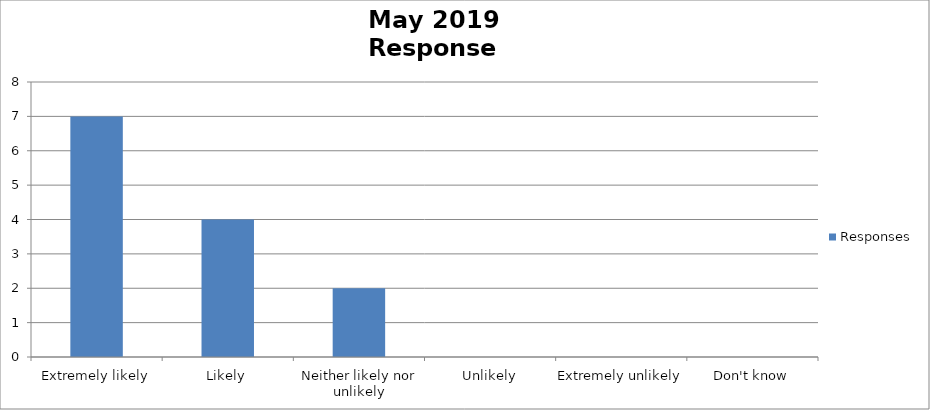
| Category | Responses |
|---|---|
| Extremely likely | 7 |
| Likely | 4 |
| Neither likely nor unlikely | 2 |
| Unlikely | 0 |
| Extremely unlikely | 0 |
| Don't know | 0 |